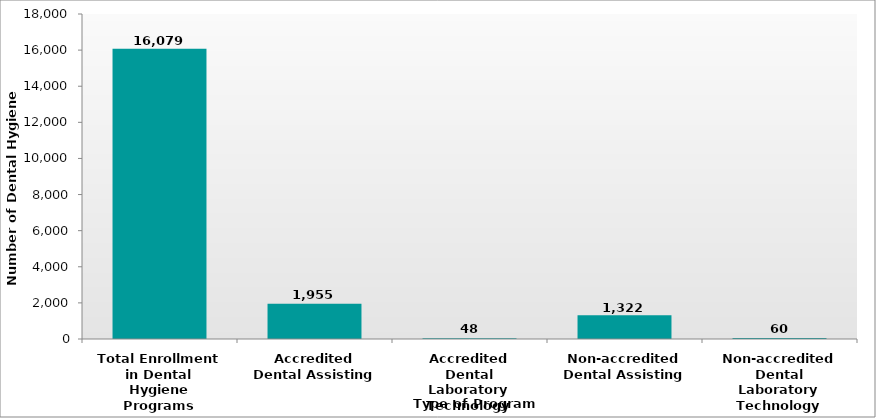
| Category | Number of Dental Hygiene Students |
|---|---|
| Total Enrollment in Dental Hygiene Programs | 16079 |
| Accredited Dental Assisting | 1955 |
| Accredited Dental Laboratory Technology | 48 |
| Non-accredited Dental Assisting | 1322 |
| Non-accredited Dental Laboratory Technology | 60 |